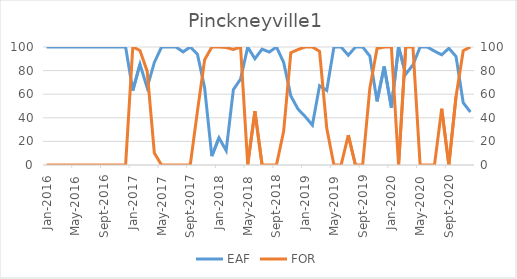
| Category | EAF |
|---|---|
| 2016-01-01 | 100 |
| 2016-02-01 | 100 |
| 2016-03-01 | 100 |
| 2016-04-01 | 100 |
| 2016-05-01 | 100 |
| 2016-06-01 | 100 |
| 2016-07-01 | 100 |
| 2016-08-01 | 100 |
| 2016-09-01 | 100 |
| 2016-10-01 | 100 |
| 2016-11-01 | 100 |
| 2016-12-01 | 100 |
| 2017-01-01 | 63.04 |
| 2017-02-01 | 85.42 |
| 2017-03-01 | 65.59 |
| 2017-04-01 | 86.94 |
| 2017-05-01 | 100 |
| 2017-06-01 | 100 |
| 2017-07-01 | 100 |
| 2017-08-01 | 95.91 |
| 2017-09-01 | 100 |
| 2017-10-01 | 93.83 |
| 2017-11-01 | 65.46 |
| 2017-12-01 | 7.54 |
| 2018-01-01 | 23.02 |
| 2018-02-01 | 12.21 |
| 2018-03-01 | 63.86 |
| 2018-04-01 | 72.79 |
| 2018-05-01 | 99.91 |
| 2018-06-01 | 90.07 |
| 2018-07-01 | 98.16 |
| 2018-08-01 | 95.72 |
| 2018-09-01 | 100 |
| 2018-10-01 | 87.01 |
| 2018-11-01 | 58.52 |
| 2018-12-01 | 47.37 |
| 2019-01-01 | 41.04 |
| 2019-02-01 | 33.82 |
| 2019-03-01 | 67.17 |
| 2019-04-01 | 63.24 |
| 2019-05-01 | 100 |
| 2019-06-01 | 100 |
| 2019-07-01 | 93.02 |
| 2019-08-01 | 100 |
| 2019-09-01 | 100 |
| 2019-10-01 | 92.36 |
| 2019-11-01 | 53.95 |
| 2019-12-01 | 83.49 |
| 2020-01-01 | 48.69 |
| 2020-02-01 | 100 |
| 2020-03-01 | 77 |
| 2020-04-01 | 84.83 |
| 2020-05-01 | 100 |
| 2020-06-01 | 100 |
| 2020-07-01 | 96.51 |
| 2020-08-01 | 93.37 |
| 2020-09-01 | 98.89 |
| 2020-10-01 | 91.96 |
| 2020-11-01 | 52.73 |
| 2020-12-01 | 44.89 |